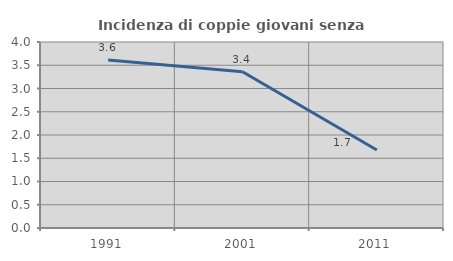
| Category | Incidenza di coppie giovani senza figli |
|---|---|
| 1991.0 | 3.612 |
| 2001.0 | 3.361 |
| 2011.0 | 1.678 |